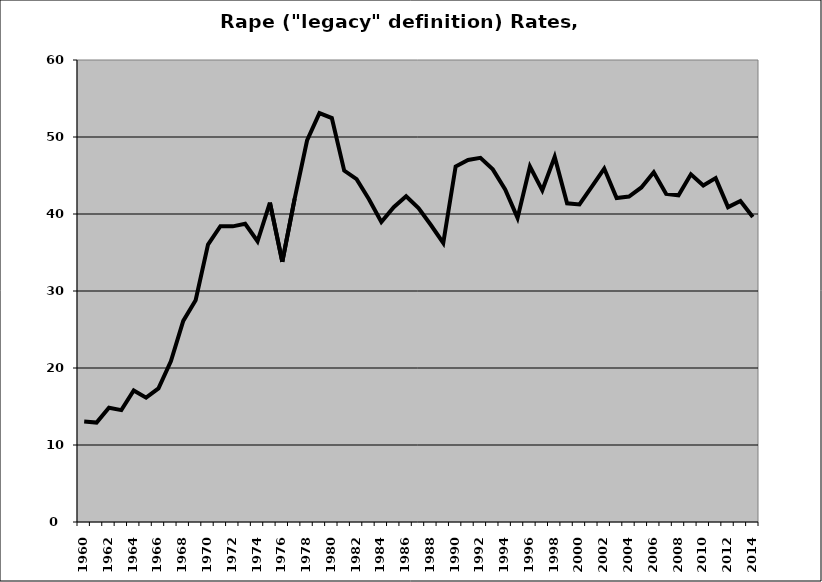
| Category | Rape |
|---|---|
| 1960.0 | 13.056 |
| 1961.0 | 12.914 |
| 1962.0 | 14.84 |
| 1963.0 | 14.533 |
| 1964.0 | 17.091 |
| 1965.0 | 16.15 |
| 1966.0 | 17.35 |
| 1967.0 | 20.861 |
| 1968.0 | 26.123 |
| 1969.0 | 28.81 |
| 1970.0 | 36.018 |
| 1971.0 | 38.414 |
| 1972.0 | 38.396 |
| 1973.0 | 38.736 |
| 1974.0 | 36.458 |
| 1975.0 | 41.476 |
| 1976.0 | 33.798 |
| 1977.0 | 42.001 |
| 1978.0 | 49.551 |
| 1979.0 | 53.102 |
| 1980.0 | 52.46 |
| 1981.0 | 45.629 |
| 1982.0 | 44.532 |
| 1983.0 | 41.924 |
| 1984.0 | 38.955 |
| 1985.0 | 40.885 |
| 1986.0 | 42.302 |
| 1987.0 | 40.777 |
| 1988.0 | 38.571 |
| 1989.0 | 36.238 |
| 1990.0 | 46.169 |
| 1991.0 | 47.024 |
| 1992.0 | 47.291 |
| 1993.0 | 45.794 |
| 1994.0 | 43.189 |
| 1995.0 | 39.498 |
| 1996.0 | 46.168 |
| 1997.0 | 43.077 |
| 1998.0 | 47.419 |
| 1999.0 | 41.394 |
| 2000.0 | 41.244 |
| 2001.0 | 43.557 |
| 2002.0 | 45.9 |
| 2003.0 | 42.066 |
| 2004.0 | 42.266 |
| 2005.0 | 43.446 |
| 2006.0 | 45.42 |
| 2007.0 | 42.6 |
| 2008.0 | 42.43 |
| 2009.0 | 45.156 |
| 2010.0 | 43.705 |
| 2011.0 | 44.661 |
| 2012.0 | 40.891 |
| 2013.0 | 41.691 |
| 2014.0 | 39.601 |